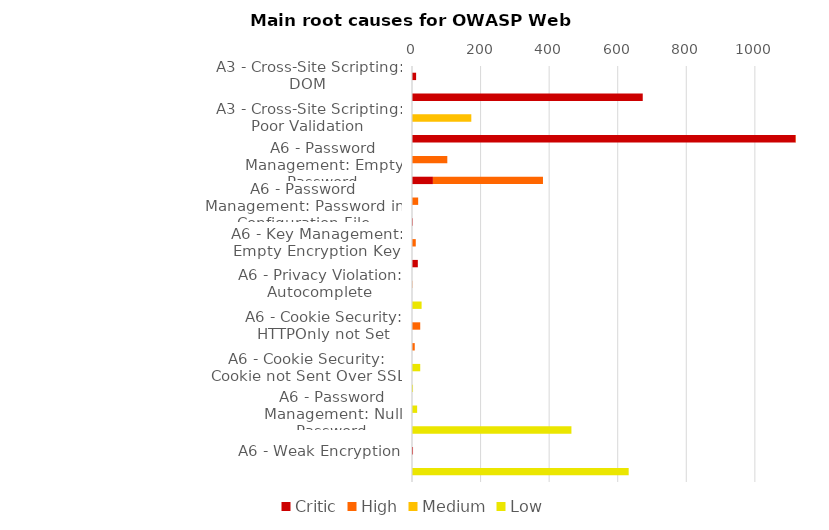
| Category | Critic | High | Medium | Low |
|---|---|---|---|---|
| A3 - Cross-Site Scripting: DOM | 12 | 0 | 0 | 0 |
| A3 - Cross-Site Scripting: Reflected | 673 | 0 | 0 | 0 |
| A3 - Cross-Site Scripting: Poor Validation | 0 | 0 | 173 | 0 |
| A6 - Key Management: Hardcoded Encryption Key | 1119 | 13 | 0 | 0 |
| A6 - Password Management: Empty Password | 0 | 103 | 0 | 0 |
| A6 - Password Management: Hardcoded Password | 61 | 321 | 0 | 0 |
| A6 - Password Management: Password in Configuration File | 0 | 18 | 0 | 0 |
| A6 - Password Management: Password in HTML Form | 2 | 0 | 0 | 0 |
| A6 - Key Management: Empty Encryption Key | 0 | 11 | 0 | 0 |
| A6 - Privacy Violation | 17 | 0 | 0 | 0 |
| A6 - Privacy Violation: Autocomplete | 0 | 1 | 0 | 0 |
| A6 - Cookie Security: Persistent Cookie | 0 | 0 | 0 | 28 |
| A6 - Cookie Security: HTTPOnly not Set | 0 | 24 | 0 | 0 |
| A6 - Cookie Security: Overly Broad Path | 0 | 8 | 0 | 0 |
| A6 - Cookie Security: Cookie not Sent Over SSL | 0 | 0 | 0 | 24 |
| A6 - Key Management: Null Encryption Key | 0 | 0 | 0 | 3 |
| A6 - Password Management: Null Password | 0 | 0 | 0 | 15 |
| A6 - Password Management: Password in Comment | 0 | 0 | 0 | 465 |
| A6 - Weak Encryption | 3 | 0 | 0 | 0 |
| A6 - Weak Cryptographic Hash | 0 | 0 | 0 | 632 |